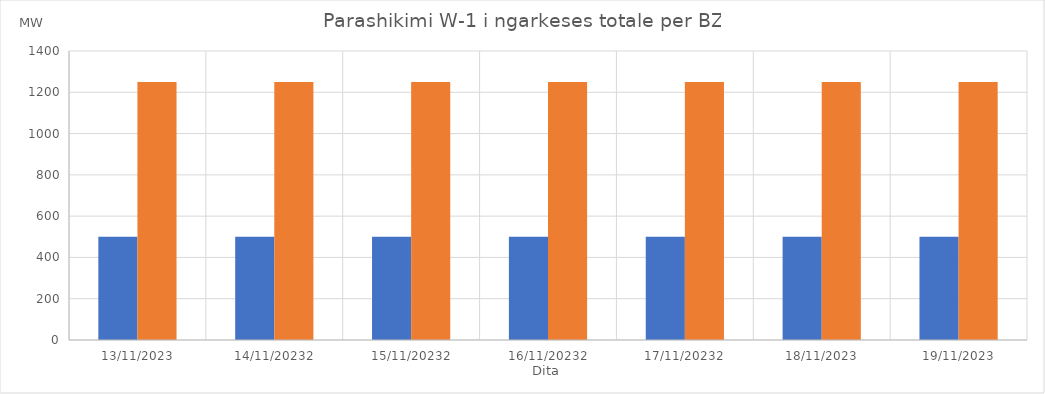
| Category | Min (MW) | Max (MW) |
|---|---|---|
| 13/11/2023 | 500 | 1250 |
| 14/11/20232 | 500 | 1250 |
| 15/11/20232 | 500 | 1250 |
| 16/11/20232 | 500 | 1250 |
| 17/11/20232 | 500 | 1250 |
| 18/11/2023 | 500 | 1250 |
| 19/11/2023 | 500 | 1250 |